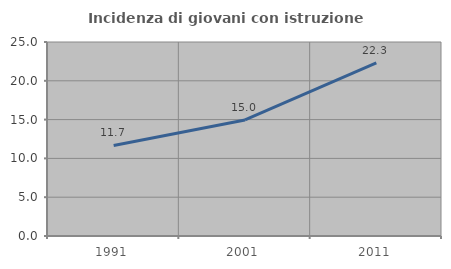
| Category | Incidenza di giovani con istruzione universitaria |
|---|---|
| 1991.0 | 11.664 |
| 2001.0 | 14.953 |
| 2011.0 | 22.304 |